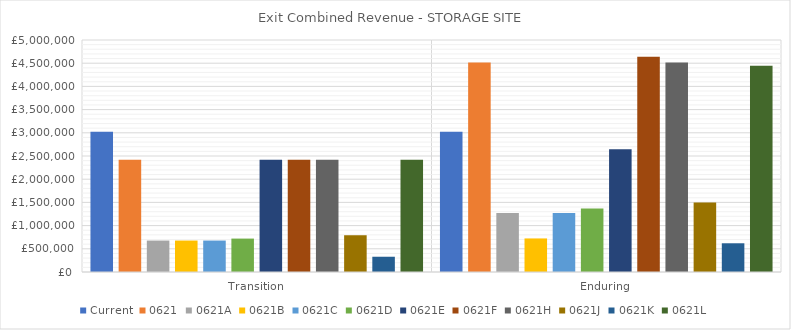
| Category | Current | 0621 | 0621A | 0621B | 0621C | 0621D | 0621E | 0621F | 0621H | 0621J | 0621K | 0621L |
|---|---|---|---|---|---|---|---|---|---|---|---|---|
| Transition | 3022394.825 | 2419914.759 | 677576.133 | 677576.133 | 677576.133 | 720132.14 | 2419914.759 | 2419914.759 | 2419914.759 | 792341.539 | 328894.718 | 2419914.759 |
| Enduring | 3022394.825 | 4512902.707 | 1273371.159 | 723309.351 | 1273371.159 | 1367145.822 | 2648025.556 | 4637875.656 | 4512902.707 | 1500197.561 | 619049.7 | 4445325.993 |